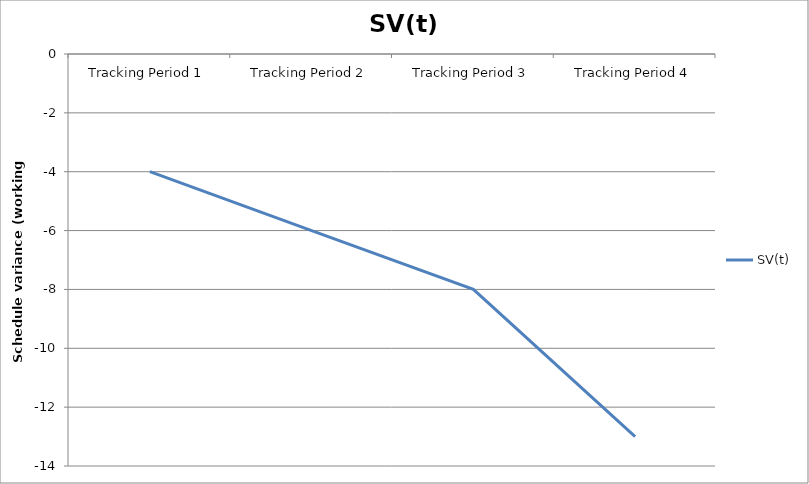
| Category | SV(t) |
|---|---|
| Tracking Period 1 | -4 |
| Tracking Period 2 | -6 |
| Tracking Period 3 | -8 |
| Tracking Period 4 | -13 |